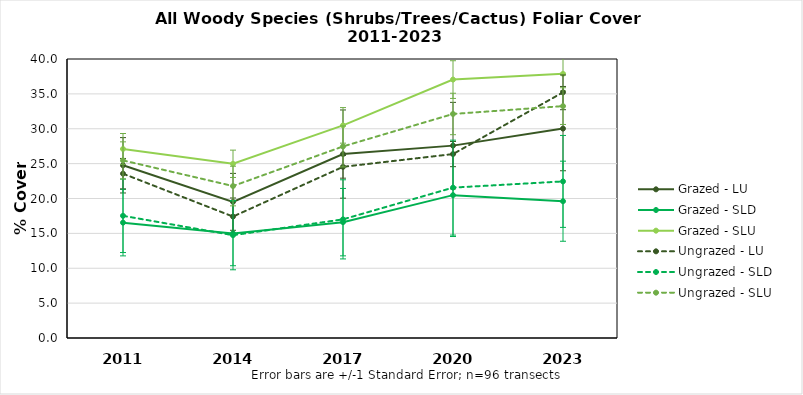
| Category | Grazed - LU | Grazed - SLD | Grazed - SLU | Ungrazed - LU | Ungrazed - SLD | Ungrazed - SLU |
|---|---|---|---|---|---|---|
| 2011.0 | 24.76 | 16.54 | 27.102 | 23.56 | 17.52 | 25.462 |
| 2014.0 | 19.52 | 15 | 24.975 | 17.41 | 14.74 | 21.787 |
| 2017.0 | 26.37 | 16.61 | 30.485 | 24.54 | 17.01 | 27.465 |
| 2020.0 | 27.58 | 20.48 | 37.05 | 26.37 | 21.56 | 32.119 |
| 2023.0 | 30.02 | 19.61 | 37.873 | 35.22 | 22.45 | 33.246 |